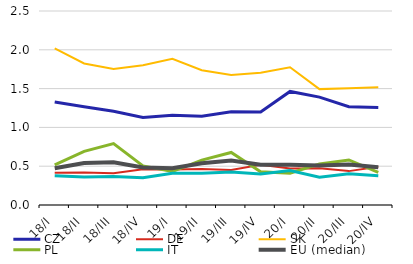
| Category | CZ | DE | SK | PL | IT | EU (median) |
|---|---|---|---|---|---|---|
| 18/I | 1.328 | 0.415 | 2.019 | 0.517 | 0.378 | 0.473 |
| 18/II | 1.266 | 0.418 | 1.823 | 0.692 | 0.36 | 0.54 |
| 18/III | 1.207 | 0.41 | 1.751 | 0.79 | 0.367 | 0.551 |
| 18/IV | 1.129 | 0.461 | 1.801 | 0.504 | 0.353 | 0.483 |
| 19/I | 1.158 | 0.458 | 1.884 | 0.431 | 0.409 | 0.473 |
| 19/II | 1.144 | 0.464 | 1.737 | 0.578 | 0.41 | 0.537 |
| 19/III | 1.201 | 0.451 | 1.677 | 0.677 | 0.424 | 0.575 |
| 19/IV | 1.197 | 0.518 | 1.705 | 0.427 | 0.401 | 0.518 |
| 20/I | 1.464 | 0.471 | 1.775 | 0.409 | 0.444 | 0.518 |
| 20/II | 1.39 | 0.475 | 1.493 | 0.529 | 0.359 | 0.508 |
| 20/III | 1.267 | 0.437 | 1.504 | 0.58 | 0.403 | 0.522 |
| 20/IV | 1.257 | 0.494 | 1.519 | 0.421 | 0.378 | 0.485 |